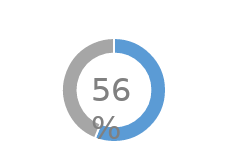
| Category | Series 0 |
|---|---|
| 0 | 0.56 |
| 1 | 0.44 |